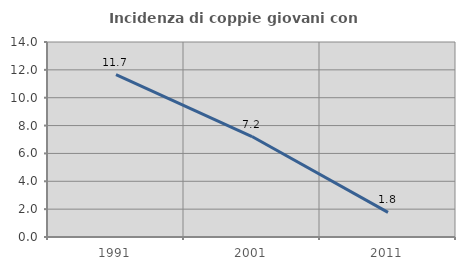
| Category | Incidenza di coppie giovani con figli |
|---|---|
| 1991.0 | 11.659 |
| 2001.0 | 7.212 |
| 2011.0 | 1.765 |